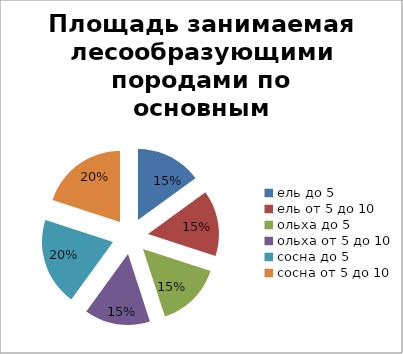
| Category | Series 0 |
|---|---|
| ель до 5 | 15 |
| ель от 5 до 10 | 15 |
| ольха до 5 | 15 |
| ольха от 5 до 10 | 15 |
| сосна до 5 | 20 |
| сосна от 5 до 10 | 20 |